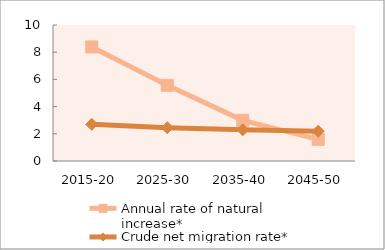
| Category | Annual rate of natural increase* | Crude net migration rate* |
|---|---|---|
| 2015-20 | 8.386 | 2.695 |
| 2025-30 | 5.563 | 2.449 |
| 2035-40 | 2.988 | 2.294 |
| 2045-50 | 1.594 | 2.194 |